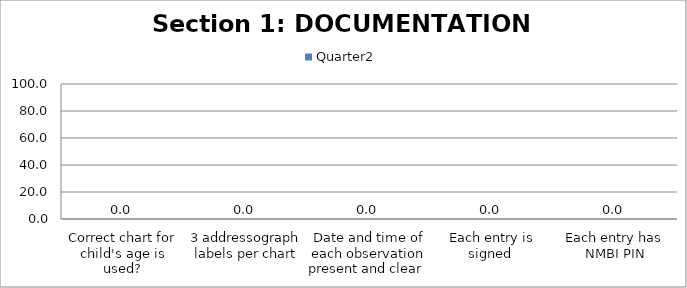
| Category | Quarter2 |
|---|---|
| Correct chart for child's age is used? | 0 |
| 3 addressograph labels per chart | 0 |
| Date and time of each observation present and clear  | 0 |
| Each entry is signed  | 0 |
| Each entry has NMBI PIN | 0 |